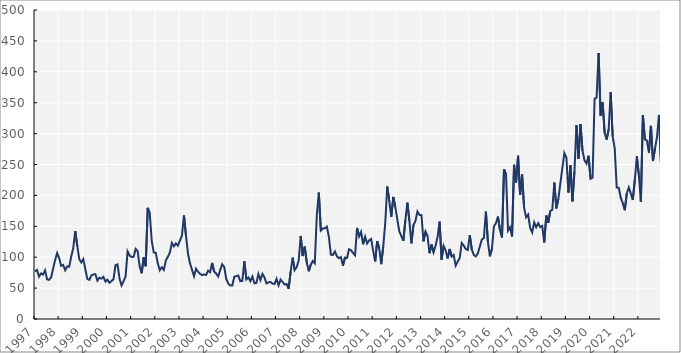
| Category | Series 1 |
|---|---|
| 1997.0 | 76.907 |
| nan | 79.426 |
| nan | 68.601 |
| nan | 73.801 |
| nan | 71.875 |
| nan | 78.738 |
| nan | 64.266 |
| nan | 63.376 |
| nan | 67.277 |
| nan | 81.501 |
| nan | 95.27 |
| nan | 106.752 |
| 1998.0 | 98.49 |
| nan | 85.851 |
| nan | 87.442 |
| nan | 78.992 |
| nan | 85.127 |
| nan | 84.634 |
| nan | 101.263 |
| nan | 114.548 |
| nan | 142.374 |
| nan | 118.308 |
| nan | 96.75 |
| nan | 91.487 |
| 1999.0 | 96.871 |
| nan | 80.483 |
| nan | 64.839 |
| nan | 63.343 |
| nan | 70.479 |
| nan | 72.08 |
| nan | 72.467 |
| nan | 62.152 |
| nan | 66.773 |
| nan | 65.277 |
| nan | 68.152 |
| nan | 60.51 |
| 2000.0 | 63.604 |
| nan | 58.703 |
| nan | 61.316 |
| nan | 64.554 |
| nan | 87.116 |
| nan | 88.401 |
| nan | 65.299 |
| nan | 54.315 |
| nan | 60.978 |
| nan | 68.964 |
| nan | 109.237 |
| nan | 102.686 |
| 2001.0 | 100.368 |
| nan | 100.59 |
| nan | 113.436 |
| nan | 109.87 |
| nan | 84.883 |
| nan | 74.084 |
| nan | 100.074 |
| nan | 85.283 |
| nan | 179.846 |
| nan | 170.869 |
| nan | 126.151 |
| nan | 107.735 |
| 2002.0 | 106.975 |
| nan | 89.9 |
| nan | 78.782 |
| nan | 83.714 |
| nan | 79.429 |
| nan | 94.729 |
| nan | 100.618 |
| nan | 107.525 |
| nan | 123.11 |
| nan | 117.63 |
| nan | 122.38 |
| nan | 118.599 |
| 2003.0 | 127.125 |
| nan | 135.089 |
| nan | 167.749 |
| nan | 134.797 |
| nan | 105.893 |
| nan | 90.049 |
| nan | 79.712 |
| nan | 69.102 |
| nan | 81.281 |
| nan | 76.263 |
| nan | 73.04 |
| nan | 70.877 |
| 2004.0 | 72.277 |
| nan | 71.115 |
| nan | 78.166 |
| nan | 75.739 |
| nan | 90.807 |
| nan | 76.721 |
| nan | 73.587 |
| nan | 68.774 |
| nan | 79.167 |
| nan | 88.632 |
| nan | 84.362 |
| nan | 64.9 |
| 2005.0 | 57.598 |
| nan | 54.23 |
| nan | 54.131 |
| nan | 68.334 |
| nan | 69.4 |
| nan | 70.335 |
| nan | 61.279 |
| nan | 61.751 |
| nan | 93.474 |
| nan | 64.226 |
| nan | 67.343 |
| nan | 61.148 |
| 2006.0 | 68.657 |
| nan | 57.768 |
| nan | 58.463 |
| nan | 72.863 |
| nan | 63.063 |
| nan | 73.058 |
| nan | 67.455 |
| nan | 57.59 |
| nan | 59.286 |
| nan | 59.909 |
| nan | 57.382 |
| nan | 56.612 |
| 2007.0 | 64.943 |
| nan | 54.53 |
| nan | 63.716 |
| nan | 59.942 |
| nan | 55.846 |
| nan | 56.614 |
| nan | 48.875 |
| nan | 76.579 |
| nan | 99.193 |
| nan | 79.078 |
| nan | 83.918 |
| nan | 94.475 |
| 2008.0 | 134.434 |
| nan | 101.801 |
| nan | 117.139 |
| nan | 91.67 |
| nan | 77.278 |
| nan | 87.881 |
| nan | 93.766 |
| nan | 90.108 |
| nan | 167.676 |
| nan | 204.588 |
| nan | 143.149 |
| nan | 146.404 |
| 2009.0 | 146.843 |
| nan | 149.465 |
| nan | 132.828 |
| nan | 104.076 |
| nan | 103.649 |
| nan | 109.302 |
| nan | 101.378 |
| nan | 98.343 |
| nan | 100.156 |
| nan | 86.336 |
| nan | 99.381 |
| nan | 98.789 |
| 2010.0 | 112.966 |
| nan | 111.313 |
| nan | 106.728 |
| nan | 103.248 |
| nan | 147.391 |
| nan | 133.573 |
| nan | 141.054 |
| nan | 120.88 |
| nan | 133.107 |
| nan | 122.156 |
| nan | 127.198 |
| nan | 129.458 |
| 2011.0 | 110.183 |
| nan | 93.205 |
| nan | 125.953 |
| nan | 114.642 |
| nan | 88.692 |
| nan | 117.026 |
| nan | 155.288 |
| nan | 214.363 |
| nan | 190.957 |
| nan | 165.13 |
| nan | 197.573 |
| nan | 181.424 |
| 2012.0 | 160.909 |
| nan | 141.624 |
| nan | 134.293 |
| nan | 126.486 |
| nan | 159.537 |
| nan | 188.156 |
| nan | 158.867 |
| nan | 122.473 |
| nan | 151.858 |
| nan | 158.585 |
| nan | 173.9 |
| nan | 168.531 |
| 2013.0 | 167.8 |
| nan | 125.669 |
| nan | 141.663 |
| nan | 134.608 |
| nan | 106.459 |
| nan | 120.418 |
| nan | 107.935 |
| nan | 118.644 |
| nan | 132.718 |
| nan | 157.553 |
| nan | 96.041 |
| nan | 118.342 |
| 2014.0 | 110.888 |
| nan | 97.96 |
| nan | 113.281 |
| nan | 101.136 |
| nan | 103.698 |
| nan | 86.299 |
| nan | 92.866 |
| nan | 98.868 |
| nan | 123.024 |
| nan | 118.848 |
| nan | 113.213 |
| nan | 111.583 |
| 2015.0 | 135.771 |
| nan | 112.288 |
| nan | 103.688 |
| nan | 101.335 |
| nan | 106.039 |
| nan | 117.486 |
| nan | 128.786 |
| nan | 130.844 |
| nan | 173.741 |
| nan | 124.653 |
| nan | 101.499 |
| nan | 113.275 |
| 2016.0 | 149.848 |
| nan | 154.966 |
| nan | 165.677 |
| nan | 143.881 |
| nan | 131.831 |
| nan | 242.042 |
| nan | 234.318 |
| nan | 143.101 |
| nan | 148.406 |
| nan | 133.465 |
| nan | 249.449 |
| nan | 221.04 |
| 2017.0 | 264.076 |
| nan | 200.659 |
| nan | 233.822 |
| nan | 179.64 |
| nan | 164.506 |
| nan | 168.955 |
| nan | 147.196 |
| nan | 140.149 |
| nan | 156.275 |
| nan | 148.558 |
| nan | 155.036 |
| nan | 148.64 |
| 2018.0 | 150.608 |
| nan | 123.855 |
| nan | 167.388 |
| nan | 155.847 |
| nan | 174.738 |
| nan | 176.694 |
| nan | 220.962 |
| nan | 178.977 |
| nan | 194.214 |
| nan | 219.473 |
| nan | 244.52 |
| nan | 268.525 |
| 2019.0 | 261.006 |
| nan | 204.548 |
| nan | 248.894 |
| nan | 190.293 |
| nan | 238.88 |
| nan | 313.641 |
| nan | 259.031 |
| nan | 315.375 |
| nan | 272.161 |
| nan | 256.689 |
| nan | 251.508 |
| nan | 264.158 |
| 2020.0 | 226.879 |
| nan | 228.679 |
| nan | 356.234 |
| nan | 358.042 |
| nan | 430.274 |
| nan | 328.955 |
| nan | 351.197 |
| nan | 301.276 |
| nan | 290.265 |
| nan | 306.693 |
| nan | 366.949 |
| nan | 295.087 |
| 2021.0 | 276.496 |
| nan | 212.669 |
| nan | 212.406 |
| nan | 196.417 |
| nan | 187.502 |
| nan | 176.018 |
| nan | 203.285 |
| nan | 212.974 |
| nan | 202.897 |
| nan | 192.615 |
| nan | 225.397 |
| nan | 263.06 |
| 2022.0 | 232.694 |
| nan | 189.451 |
| nan | 329.954 |
| nan | 290.477 |
| nan | 288.966 |
| nan | 268.984 |
| nan | 312.507 |
| nan | 255.59 |
| nan | 275.354 |
| nan | 294.105 |
| nan | 330.213 |
| nan | 250.344 |